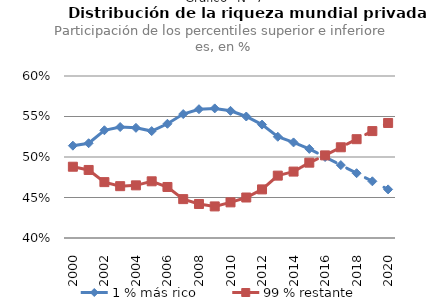
| Category | 1 % más rico | 99 % restante |
|---|---|---|
| 2000.0 | 0.514 | 0.488 |
| 2001.0 | 0.517 | 0.484 |
| 2002.0 | 0.533 | 0.469 |
| 2003.0 | 0.537 | 0.464 |
| 2004.0 | 0.536 | 0.465 |
| 2005.0 | 0.532 | 0.47 |
| 2006.0 | 0.541 | 0.463 |
| 2007.0 | 0.553 | 0.448 |
| 2008.0 | 0.559 | 0.442 |
| 2009.0 | 0.56 | 0.439 |
| 2010.0 | 0.557 | 0.444 |
| 2011.0 | 0.55 | 0.45 |
| 2012.0 | 0.54 | 0.46 |
| 2013.0 | 0.525 | 0.477 |
| 2014.0 | 0.518 | 0.482 |
| 2015.0 | 0.51 | 0.493 |
| 2016.0 | 0.5 | 0.502 |
| 2017.0 | 0.49 | 0.512 |
| 2018.0 | 0.48 | 0.522 |
| 2019.0 | 0.47 | 0.532 |
| 2020.0 | 0.46 | 0.542 |